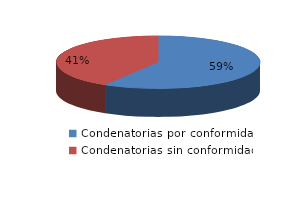
| Category | Series 0 |
|---|---|
| 0 | 78 |
| 1 | 55 |